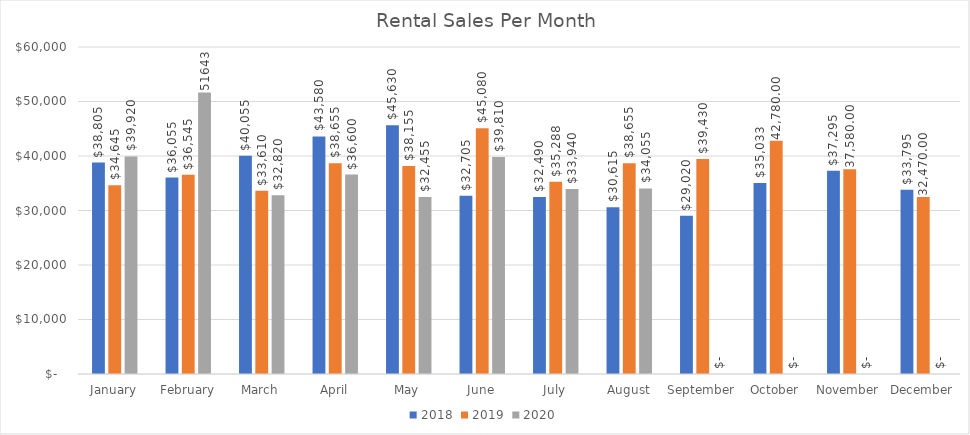
| Category | 2018 | 2019 | 2020 |
|---|---|---|---|
| January | 38805 | 34645 | 39920 |
| February | 36055 | 36545 | 51643 |
| March | 40055 | 33610 | 32820 |
| April | 43580 | 38655 | 36599.96 |
| May | 45630 | 38155 | 32455 |
| June | 32705 | 45080 | 39810 |
| July | 32490 | 35288.48 | 33940 |
| August | 30615 | 38655 | 34055 |
| September | 29020 | 39430 | 0 |
| October | 35032.5 | 42780 | 0 |
| November | 37295 | 37580 | 0 |
| December | 33795 | 32470 | 0 |